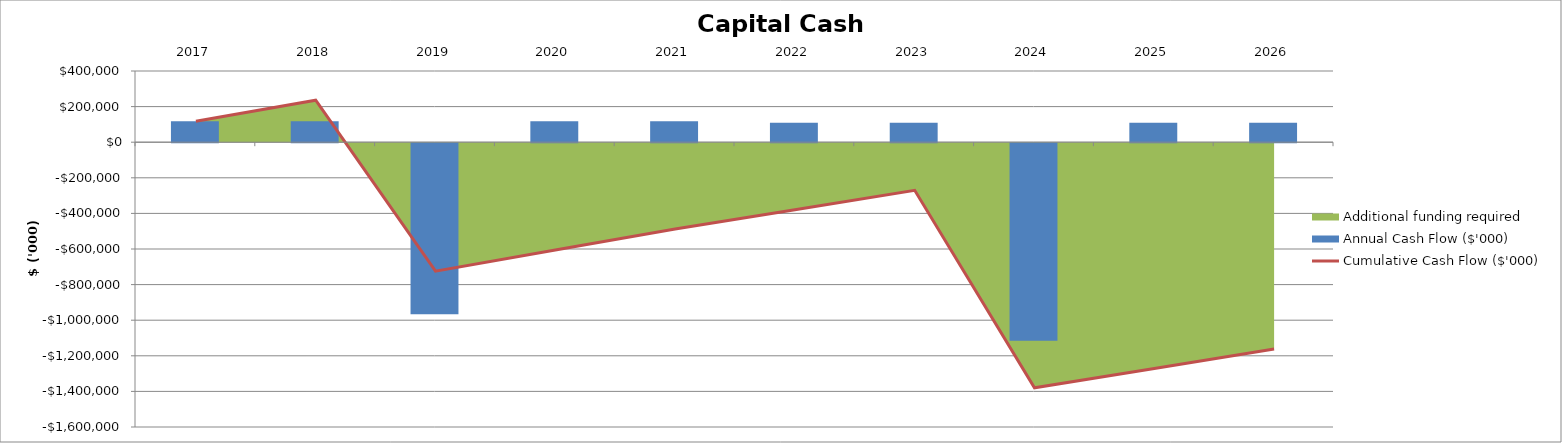
| Category | Annual Cash Flow ($'000) |
|---|---|
| 2017.0 | 118097.438 |
| 2018.0 | 118097.438 |
| 2019.0 | -960411.973 |
| 2020.0 | 118097.438 |
| 2021.0 | 118097.438 |
| 2022.0 | 108886.594 |
| 2023.0 | 108886.594 |
| 2024.0 | -1109413.224 |
| 2025.0 | 108886.594 |
| 2026.0 | 108886.594 |